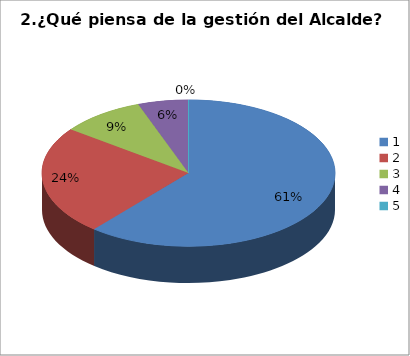
| Category | Series 0 |
|---|---|
| 0 | 33 |
| 1 | 13 |
| 2 | 5 |
| 3 | 3 |
| 4 | 0 |